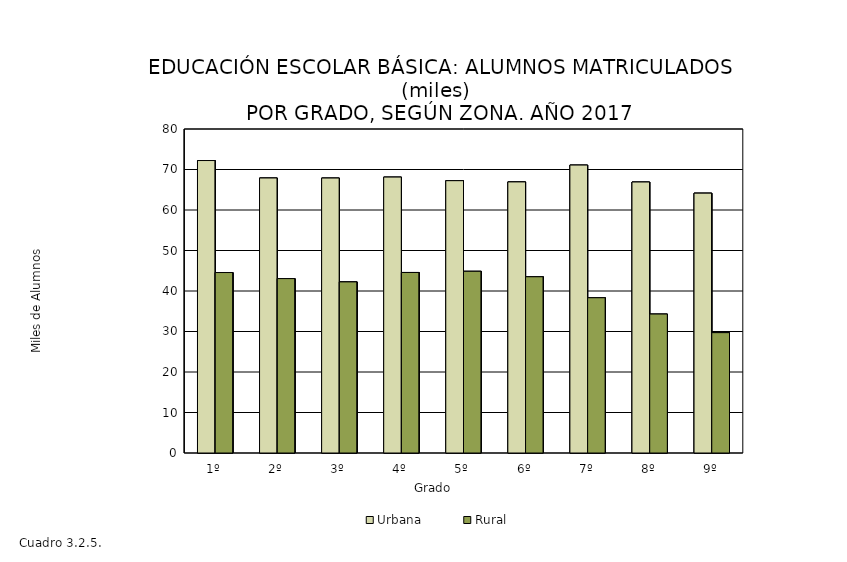
| Category | Urbana | Rural |
|---|---|---|
| 1º | 72.211 | 44.56 |
| 2º | 67.904 | 43.061 |
| 3º | 67.891 | 42.249 |
| 4º | 68.127 | 44.573 |
| 5º | 67.239 | 44.867 |
| 6º | 66.934 | 43.518 |
| 7º | 71.095 | 38.334 |
| 8º | 66.912 | 34.308 |
| 9º | 64.164 | 29.718 |